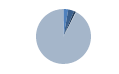
| Category | Series 0 |
|---|---|
| ARRASTRE | 22 |
| CERCO | 27 |
| PALANGRE | 10 |
| REDES DE ENMALLE | 2 |
| ARTES MENORES | 726 |
| SIN TIPO ASIGNADO | 1 |